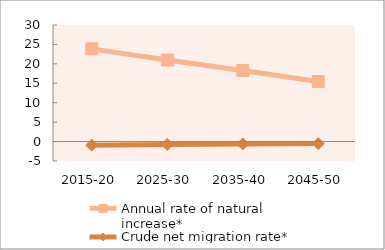
| Category | Annual rate of natural increase* | Crude net migration rate* |
|---|---|---|
| 2015-20 | 23.862 | -0.924 |
| 2025-30 | 20.984 | -0.745 |
| 2035-40 | 18.301 | -0.616 |
| 2045-50 | 15.453 | -0.524 |